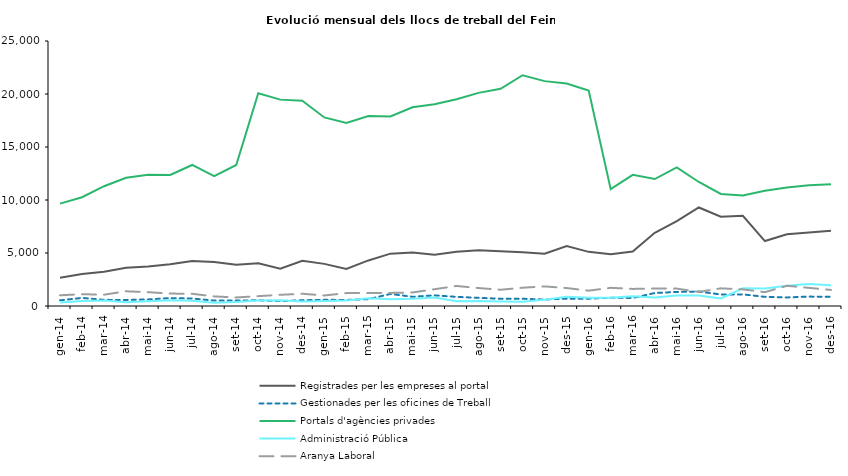
| Category | Registrades per les empreses al portal | Gestionades per les oficines de Treball | Portals d'agències privades | Administració Pública | Aranya Laboral |
|---|---|---|---|---|---|
| gen-14 | 2655 | 537 | 9661 | 330 | 1011 |
| feb-14 | 3024 | 762 | 10259 | 479 | 1114 |
| mar-14 | 3234 | 581 | 11302 | 508 | 1066 |
| abr-14 | 3615 | 566 | 12103 | 358 | 1389 |
| mai-14 | 3720 | 620 | 12375 | 444 | 1304 |
| jun-14 | 3949 | 746 | 12360 | 547 | 1172 |
| jul-14 | 4237 | 707 | 13305 | 485 | 1152 |
| ago-14 | 4161 | 514 | 12242 | 318 | 905 |
| set-14 | 3895 | 510 | 13301 | 367 | 806 |
| oct-14 | 4023 | 542 | 20066 | 519 | 929 |
| nov-14 | 3520 | 459 | 19469 | 549 | 1055 |
| des-14 | 4257 | 542 | 19369 | 434 | 1157 |
| gen-15 | 3975 | 583 | 17789 | 474 | 994 |
| feb-15 | 3487 | 571 | 17264 | 529 | 1216 |
| mar-15 | 4298 | 646 | 17927 | 736 | 1223 |
| abr-15 | 4937 | 1138 | 17879 | 642 | 1234 |
| mai-15 | 5047 | 869 | 18750 | 692 | 1276 |
| jun-15 | 4836 | 1005 | 19031 | 808 | 1582 |
| jul-15 | 5117 | 861 | 19502 | 446 | 1890 |
| ago-15 | 5263 | 771 | 20108 | 467 | 1692 |
| set-15 | 5164 | 685 | 20497 | 421 | 1534 |
| oct-15 | 5082 | 682 | 21770 | 404 | 1725 |
| nov-15 | 4940 | 610 | 21215 | 590 | 1849 |
| des-15 | 5647 | 694 | 20994 | 863 | 1694 |
| gen-16 | 5107 | 691 | 20322 | 774 | 1447 |
| feb-16 | 4887 | 779 | 11028 | 777 | 1716 |
| mar-16 | 5133 | 759 | 12378 | 911 | 1611 |
| abr-16 | 6906 | 1226 | 11980 | 807 | 1653 |
| mai-16 | 7999 | 1325 | 13085 | 983 | 1639 |
| jun-16 | 9293 | 1366 | 11700 | 984 | 1327 |
| jul-16 | 8417 | 1084 | 10572 | 713 | 1667 |
| ago-16 | 8503 | 1097 | 10425 | 1663 | 1568 |
| set-16 | 6126 | 862 | 10864 | 1660 | 1305 |
| oct-16 | 6759 | 808 | 11178 | 1919 | 1909 |
| nov-16 | 6939 | 887 | 11381 | 2080 | 1711 |
| des-16 | 7090 | 866 | 11486 | 1953 | 1517 |